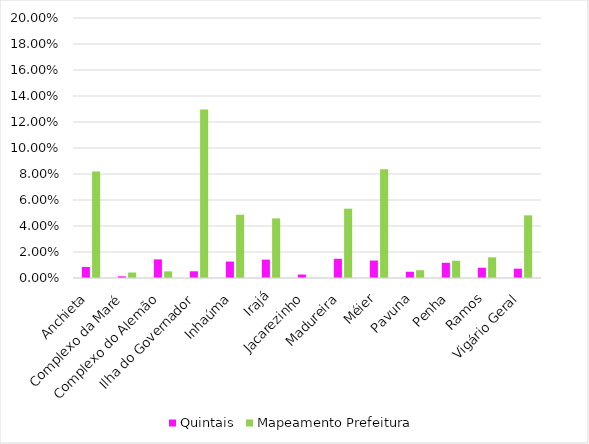
| Category | Quintais | Mapeamento Prefeitura |
|---|---|---|
| Anchieta | 0.009 | 0.082 |
| Complexo da Maré | 0.001 | 0.004 |
| Complexo do Alemão | 0.014 | 0.005 |
| Ilha do Governador | 0.005 | 0.13 |
| Inhaúma | 0.013 | 0.049 |
| Irajá | 0.014 | 0.046 |
| Jacarezinho | 0.003 | 0 |
| Madureira | 0.015 | 0.053 |
| Méier | 0.013 | 0.084 |
| Pavuna | 0.005 | 0.006 |
| Penha | 0.012 | 0.013 |
| Ramos | 0.008 | 0.016 |
| Vigário Geral | 0.007 | 0.048 |